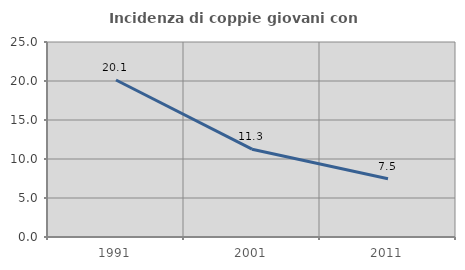
| Category | Incidenza di coppie giovani con figli |
|---|---|
| 1991.0 | 20.133 |
| 2001.0 | 11.257 |
| 2011.0 | 7.472 |